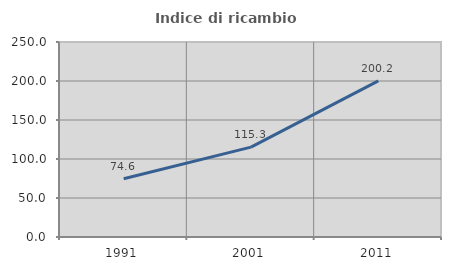
| Category | Indice di ricambio occupazionale  |
|---|---|
| 1991.0 | 74.597 |
| 2001.0 | 115.264 |
| 2011.0 | 200.196 |